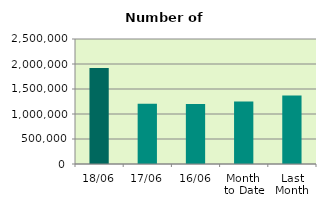
| Category | Series 0 |
|---|---|
| 18/06 | 1919770 |
| 17/06 | 1205178 |
| 16/06 | 1197704 |
| Month 
to Date | 1248096.143 |
| Last
Month | 1368600.286 |